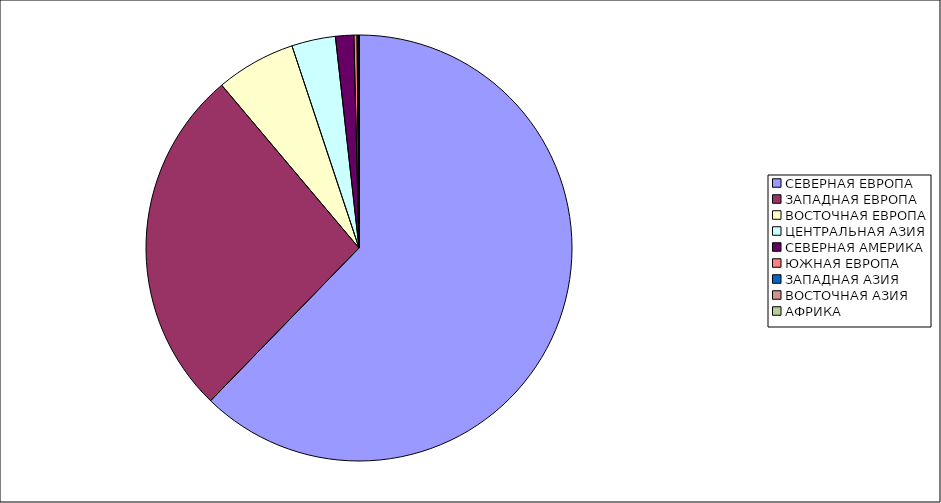
| Category | Оборот |
|---|---|
| СЕВЕРНАЯ ЕВРОПА | 62.27 |
| ЗАПАДНАЯ ЕВРОПА | 26.58 |
| ВОСТОЧНАЯ ЕВРОПА | 6.055 |
| ЦЕНТРАЛЬНАЯ АЗИЯ | 3.326 |
| СЕВЕРНАЯ АМЕРИКА | 1.386 |
| ЮЖНАЯ ЕВРОПА | 0.239 |
| ЗАПАДНАЯ АЗИЯ | 0.14 |
| ВОСТОЧНАЯ АЗИЯ | 0.004 |
| АФРИКА | 0.001 |